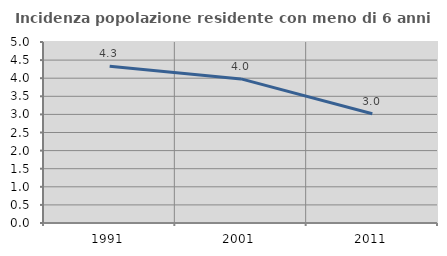
| Category | Incidenza popolazione residente con meno di 6 anni |
|---|---|
| 1991.0 | 4.328 |
| 2001.0 | 3.981 |
| 2011.0 | 3.018 |